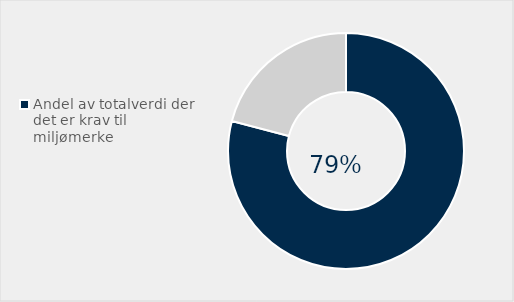
| Category | Series 0 |
|---|---|
| Andel av totalverdi der det er krav til miljømerke | 0.791 |
| Ikke brukt Type 1 - miljømerke | 0.209 |